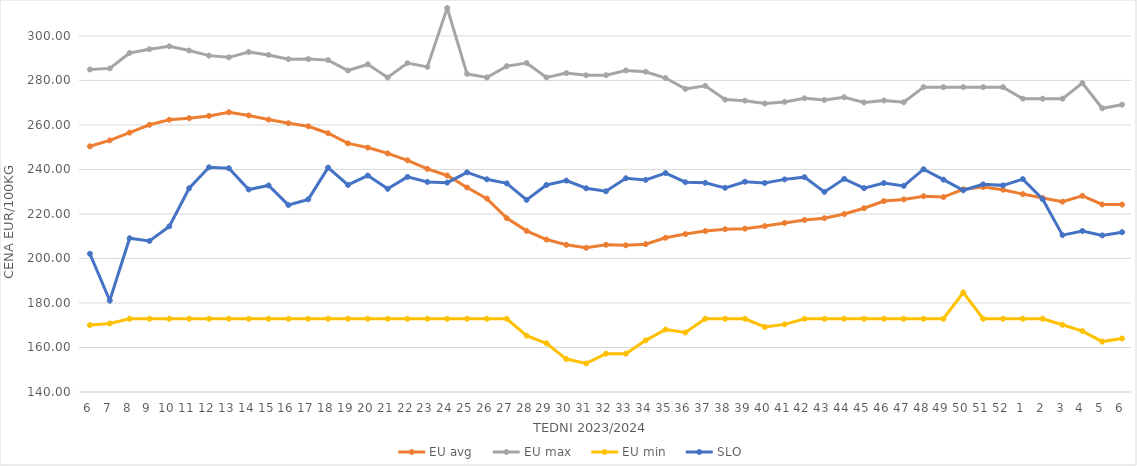
| Category | EU avg | EU max | EU min | SLO |
|---|---|---|---|---|
| 6.0 | 250.4 | 284.92 | 170.09 | 202.1 |
| 7.0 | 253.074 | 285.42 | 170.79 | 181.11 |
| 8.0 | 256.543 | 292.35 | 172.91 | 209.08 |
| 9.0 | 260.066 | 294.02 | 172.91 | 207.87 |
| 10.0 | 262.352 | 295.33 | 172.91 | 214.42 |
| 11.0 | 263.049 | 293.44 | 172.91 | 231.56 |
| 12.0 | 264.068 | 291.15 | 172.91 | 240.97 |
| 13.0 | 265.73 | 290.38 | 172.91 | 240.55 |
| 14.0 | 264.262 | 292.763 | 172.91 | 230.99 |
| 15.0 | 262.411 | 291.46 | 172.91 | 232.82 |
| 16.0 | 260.77 | 289.56 | 172.91 | 224 |
| 17.0 | 259.395 | 289.61 | 172.91 | 226.57 |
| 18.0 | 256.275 | 289.13 | 172.91 | 240.83 |
| 19.0 | 251.716 | 284.45 | 172.91 | 233.05 |
| 20.0 | 249.836 | 287.26 | 172.91 | 237.25 |
| 21.0 | 247.212 | 281.33 | 172.91 | 231.3 |
| 22.0 | 244.103 | 287.77 | 172.91 | 236.67 |
| 23.0 | 240.279 | 286.1 | 172.91 | 234.39 |
| 24.0 | 237.289 | 312.54 | 172.91 | 234.08 |
| 25.0 | 231.895 | 282.95 | 172.91 | 238.69 |
| 26.0 | 226.903 | 281.34 | 172.91 | 235.57 |
| 27.0 | 218.126 | 286.43 | 172.91 | 233.75 |
| 28.0 | 212.406 | 287.8 | 165.32 | 226.35 |
| 29.0 | 208.504 | 281.37 | 161.87 | 233.03 |
| 30.0 | 206.149 | 283.3 | 154.8 | 235 |
| 31.0 | 204.79 | 282.32 | 152.83 | 231.55 |
| 32.0 | 206.16 | 282.36 | 157.23 | 230.2 |
| 33.0 | 205.917 | 284.5 | 157.23 | 236.04 |
| 34.0 | 206.436 | 283.9 | 163.21 | 235.32 |
| 35.0 | 209.326 | 281.09 | 168.085 | 238.39 |
| 36.0 | 210.957 | 276.21 | 166.745 | 234.27 |
| 37.0 | 212.325 | 277.59 | 172.91 | 234 |
| 38.0 | 213.132 | 271.4 | 172.91 | 231.74 |
| 39.0 | 213.398 | 270.91 | 172.91 | 234.5 |
| 40.0 | 214.548 | 269.62 | 169.209 | 233.92 |
| 41.0 | 215.966 | 270.36 | 170.387 | 235.54 |
| 42.0 | 217.294 | 271.99 | 172.91 | 236.54 |
| 43.0 | 218.091 | 271.22 | 172.91 | 229.92 |
| 44.0 | 219.965 | 272.45 | 172.91 | 235.77 |
| 45.0 | 222.584 | 270.09 | 172.91 | 231.6 |
| 46.0 | 225.795 | 270.99 | 172.91 | 233.89 |
| 47.0 | 226.547 | 270.18 | 172.91 | 232.62 |
| 48.0 | 227.993 | 276.99 | 172.91 | 240.11 |
| 49.0 | 227.575 | 276.99 | 172.91 | 235.41 |
| 50.0 | 231.099 | 276.99 | 184.72 | 230.65 |
| 51.0 | 232.088 | 276.99 | 172.91 | 233.3 |
| 52.0 | 230.884 | 276.99 | 172.91 | 232.85 |
| 1.0 | 228.928 | 271.8 | 172.91 | 235.66 |
| 2.0 | 227.213 | 271.8 | 172.91 | 226.65 |
| 3.0 | 225.533 | 271.8 | 170.2 | 210.5 |
| 4.0 | 228.156 | 278.81 | 167.37 | 212.37 |
| 5.0 | 224.291 | 267.49 | 162.66 | 210.38 |
| 6.0 | 224.229 | 269.11 | 164.03 | 211.82 |